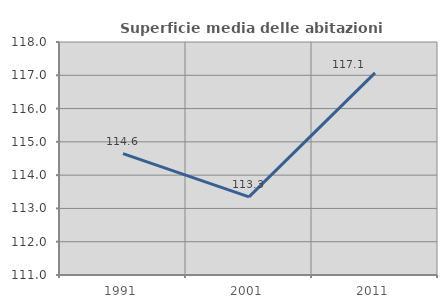
| Category | Superficie media delle abitazioni occupate |
|---|---|
| 1991.0 | 114.647 |
| 2001.0 | 113.346 |
| 2011.0 | 117.073 |